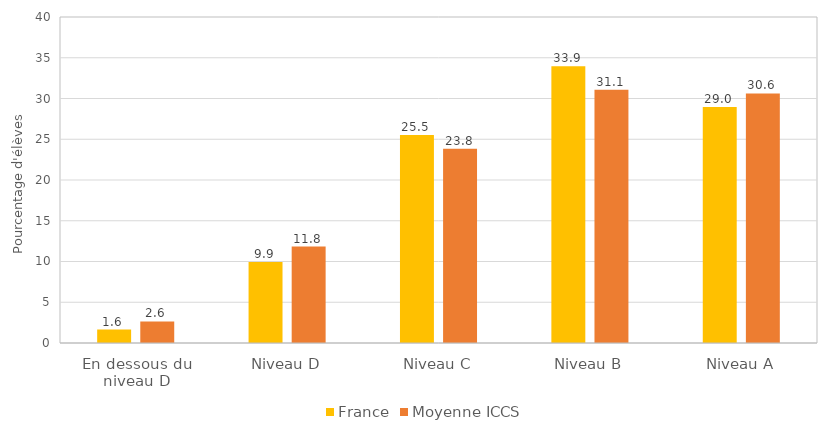
| Category | France | Moyenne ICCS |
|---|---|---|
| En dessous du niveau D | 1.647 | 2.639 |
| Niveau D | 9.931 | 11.834 |
| Niveau C | 25.518 | 23.837 |
| Niveau B | 33.946 | 31.065 |
| Niveau A | 28.958 | 30.625 |